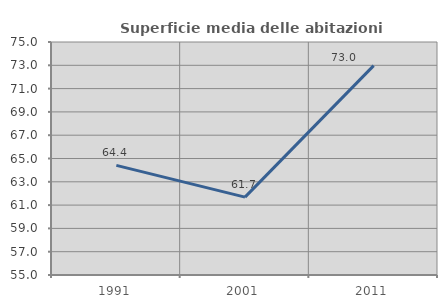
| Category | Superficie media delle abitazioni occupate |
|---|---|
| 1991.0 | 64.409 |
| 2001.0 | 61.686 |
| 2011.0 | 72.969 |